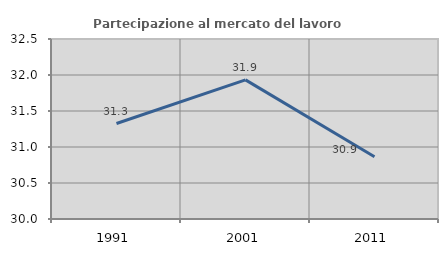
| Category | Partecipazione al mercato del lavoro  femminile |
|---|---|
| 1991.0 | 31.326 |
| 2001.0 | 31.932 |
| 2011.0 | 30.866 |